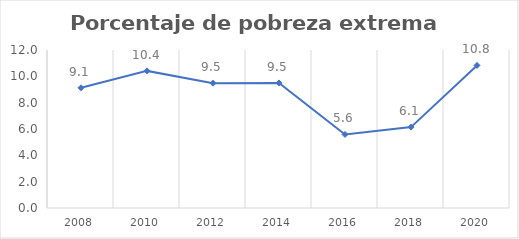
| Category | Series 0 |
|---|---|
| 2008.0 | 9.13 |
| 2010.0 | 10.413 |
| 2012.0 | 9.482 |
| 2014.0 | 9.499 |
| 2016.0 | 5.586 |
| 2018.0 | 6.144 |
| 2020.0 | 10.827 |